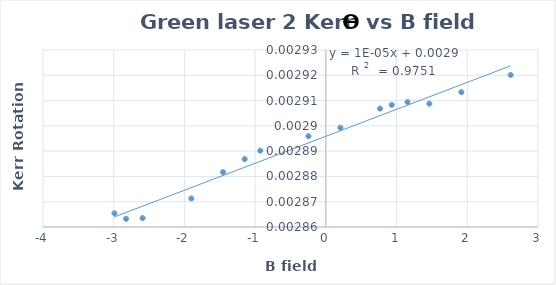
| Category | Kerr rotation vs B field |
|---|---|
| 0.20613650104754253 | 0.003 |
| 0.7653587854559196 | 0.003 |
| 0.9320593595728099 | 0.003 |
| 1.1543474248849594 | 0.003 |
| 1.463625617648605 | 0.003 |
| 1.9162003063157789 | 0.003 |
| 2.613158353421133 | 0.003 |
| -0.24573646702910656 | 0.003 |
| -0.9273105589844111 | 0.003 |
| -1.1478991442165996 | 0.003 |
| -1.4544534647503606 | 0.003 |
| -1.902454902707921 | 0.003 |
| -2.5913694992876053 | 0.003 |
| -2.8252270511296085 | 0.003 |
| -2.9899345243513897 | 0.003 |